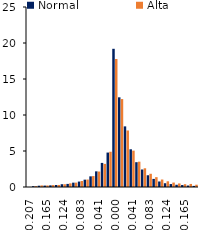
| Category | Normal | Alta |
|---|---|---|
| -0.206762101838239 | 0.002 | 0.002 |
| -0.19297796171569 | 0.112 | 0.126 |
| -0.179193821593141 | 0.179 | 0.222 |
| -0.165409681470591 | 0.197 | 0.215 |
| -0.151625541348042 | 0.228 | 0.268 |
| -0.137841401225493 | 0.276 | 0.286 |
| -0.124057261102944 | 0.385 | 0.386 |
| -0.110273120980394 | 0.43 | 0.506 |
| -0.096488980857845 | 0.603 | 0.608 |
| -0.0827048407352957 | 0.755 | 0.836 |
| -0.0689207006127464 | 1.019 | 1.036 |
| -0.0551365604901971 | 1.479 | 1.517 |
| -0.0413524203676478 | 2.173 | 2.146 |
| -0.0275682802450986 | 3.347 | 3.211 |
| -0.0137841401225493 | 4.782 | 4.898 |
| 1.38777878078145e-17 | 19.195 | 17.781 |
| 0.0137841401225493 | 12.457 | 12.213 |
| 0.0275682802450986 | 8.419 | 7.849 |
| 0.0413524203676478 | 5.238 | 5.049 |
| 0.0551365604901971 | 3.444 | 3.517 |
| 0.0689207006127464 | 2.432 | 2.599 |
| 0.0827048407352957 | 1.63 | 1.836 |
| 0.096488980857845 | 1.124 | 1.366 |
| 0.110273120980394 | 0.766 | 1.038 |
| 0.124057261102944 | 0.522 | 0.792 |
| 0.137841401225493 | 0.409 | 0.616 |
| 0.151625541348042 | 0.311 | 0.494 |
| 0.165409681470591 | 0.272 | 0.392 |
| 0.179193821593141 | 0.204 | 0.426 |
| 0.19297796171569 | 0.155 | 0.317 |